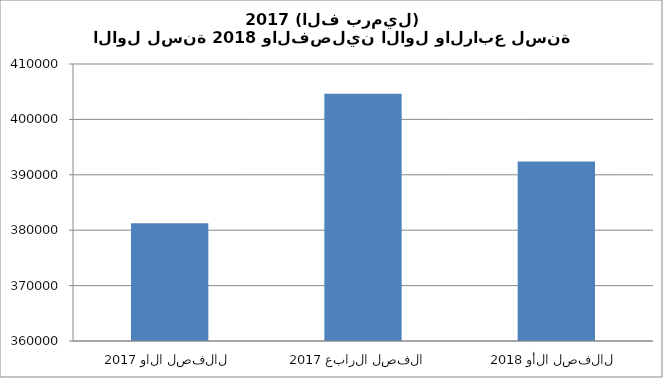
| Category | Series 0 |
|---|---|
| 2017 الفصل الاول  | 381269 |
| 2017 الفصل الرابع  | 404625 |
| 2018 الفصل الأول  | 392409 |